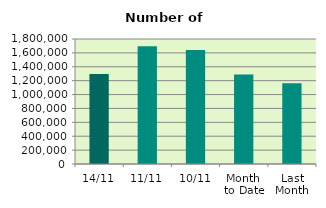
| Category | Series 0 |
|---|---|
| 14/11 | 1297270 |
| 11/11 | 1694710 |
| 10/11 | 1642920 |
| Month 
to Date | 1290583.4 |
| Last
Month | 1161301.714 |